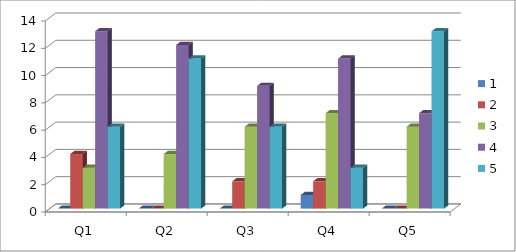
| Category | 1 | 2 | 3 | 4 | 5 |
|---|---|---|---|---|---|
| Q1 | 0 | 4 | 3 | 13 | 6 |
| Q2 | 0 | 0 | 4 | 12 | 11 |
| Q3 | 0 | 2 | 6 | 9 | 6 |
| Q4 | 1 | 2 | 7 | 11 | 3 |
| Q5 | 0 | 0 | 6 | 7 | 13 |